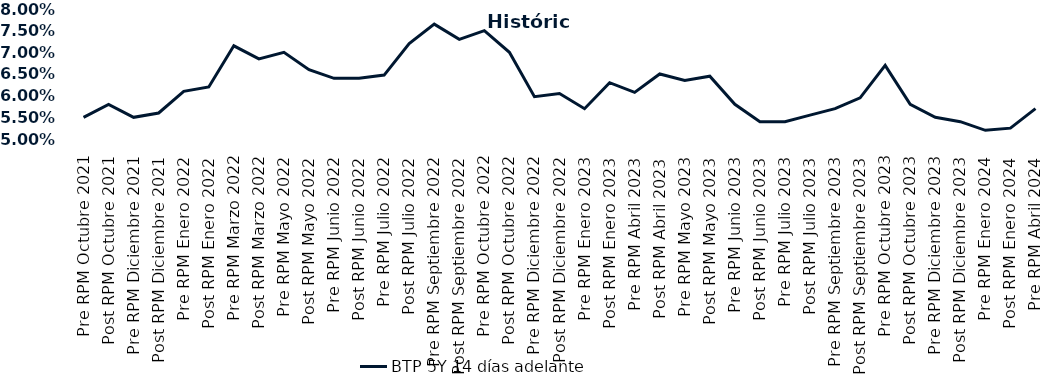
| Category | BTP 5Y 14 días adelante |
|---|---|
| Pre RPM Octubre 2021 | 0.055 |
| Post RPM Octubre 2021 | 0.058 |
| Pre RPM Diciembre 2021 | 0.055 |
| Post RPM Diciembre 2021 | 0.056 |
| Pre RPM Enero 2022 | 0.061 |
| Post RPM Enero 2022 | 0.062 |
| Pre RPM Marzo 2022 | 0.072 |
| Post RPM Marzo 2022 | 0.068 |
| Pre RPM Mayo 2022 | 0.07 |
| Post RPM Mayo 2022 | 0.066 |
| Pre RPM Junio 2022 | 0.064 |
| Post RPM Junio 2022 | 0.064 |
| Pre RPM Julio 2022 | 0.065 |
| Post RPM Julio 2022 | 0.072 |
| Pre RPM Septiembre 2022 | 0.076 |
| Post RPM Septiembre 2022 | 0.073 |
| Pre RPM Octubre 2022 | 0.075 |
| Post RPM Octubre 2022 | 0.07 |
| Pre RPM Diciembre 2022 | 0.06 |
| Post RPM Diciembre 2022 | 0.06 |
| Pre RPM Enero 2023 | 0.057 |
| Post RPM Enero 2023 | 0.063 |
| Pre RPM Abril 2023 | 0.061 |
| Post RPM Abril 2023 | 0.065 |
| Pre RPM Mayo 2023 | 0.064 |
| Post RPM Mayo 2023 | 0.064 |
| Pre RPM Junio 2023 | 0.058 |
| Post RPM Junio 2023 | 0.054 |
| Pre RPM Julio 2023 | 0.054 |
| Post RPM Julio 2023 | 0.056 |
| Pre RPM Septiembre 2023 | 0.057 |
| Post RPM Septiembre 2023 | 0.06 |
| Pre RPM Octubre 2023 | 0.067 |
| Post RPM Octubre 2023 | 0.058 |
| Pre RPM Diciembre 2023 | 0.055 |
| Post RPM Diciembre 2023 | 0.054 |
| Pre RPM Enero 2024 | 0.052 |
| Post RPM Enero 2024 | 0.052 |
| Pre RPM Abril 2024 | 0.057 |